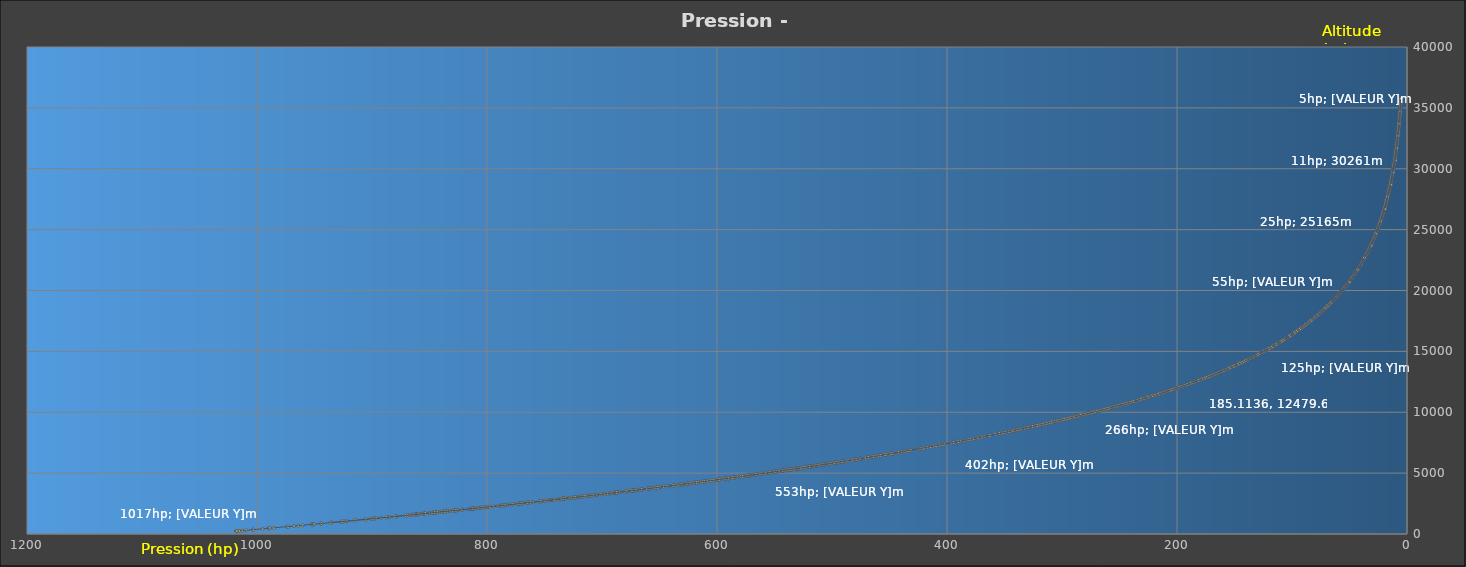
| Category | Series 0 |
|---|---|
| 1017.7116 | 235.9 |
| 1017.7116 | 236 |
| 1017.7116 | 235.9 |
| 1017.7116 | 235.9 |
| 1017.7116 | 236.3 |
| 1017.6083 | 237 |
| 1017.6083 | 237.1 |
| 1017.6083 | 237 |
| 1017.6083 | 237 |
| 1017.5049999999999 | 237.7 |
| 1017.5049999999999 | 238.2 |
| 1017.4016999999999 | 238.6 |
| 1017.0917999999999 | 241.1 |
| 1017.0917999999999 | 241 |
| 1017.1950999999999 | 240.4 |
| 1017.0917999999999 | 241.2 |
| 1016.8851999999999 | 242.8 |
| 1016.9884999999999 | 242.4 |
| 1016.9884999999999 | 242.2 |
| 1016.9884999999999 | 242.2 |
| 1017.2983999999999 | 239.4 |
| 1017.4016999999999 | 238.5 |
| 1017.4016999999999 | 238.6 |
| 1017.2983999999999 | 239.5 |
| 1015.2323999999999 | 256.8 |
| 1012.6498999999999 | 278.4 |
| 1009.4476 | 304.6 |
| 1003.6628 | 352.2 |
| 1003.0429999999999 | 357.7 |
| 994.9856 | 424.8 |
| 990.2338 | 465.6 |
| 989.5106999999999 | 471.6 |
| 988.7876 | 477.6 |
| 985.482 | 505.2 |
| 973.6025 | 606.7 |
| 972.8793999999999 | 612.6 |
| 967.8177 | 656 |
| 964.2022 | 687.3 |
| 960.2768 | 721.2 |
| 952.7358999999999 | 786.6 |
| 951.7028999999999 | 795.2 |
| 951.1863999999998 | 799.7 |
| 950.6698999999999 | 804.1 |
| 950.0500999999999 | 810 |
| 944.4718999999999 | 858 |
| 943.8521 | 863.5 |
| 934.7616999999999 | 943.8 |
| 927.0142 | 1012.3 |
| 924.3283999999999 | 1036.3 |
| 915.4445999999999 | 1116 |
| 913.6885 | 1131.6 |
| 906.4575 | 1196.7 |
| 905.2178999999999 | 1207.8 |
| 901.0858999999999 | 1245.5 |
| 899.9496 | 1256.1 |
| 898.0901999999999 | 1272.7 |
| 897.3670999999999 | 1279.6 |
| 892.0988 | 1327.8 |
| 886.0041 | 1383.6 |
| 884.5578999999999 | 1396.7 |
| 864.7243 | 1581.5 |
| 862.4517 | 1603.3 |
| 861.4187 | 1613.2 |
| 860.7988999999999 | 1618.9 |
| 860.1791 | 1624.8 |
| 859.5593 | 1630.4 |
| 857.2866999999999 | 1652.1 |
| 855.4273 | 1669.7 |
| 854.8074999999999 | 1675.7 |
| 854.1877 | 1681.9 |
| 853.4646 | 1688.1 |
| 850.4688999999998 | 1716.8 |
| 849.8491 | 1722.9 |
| 847.06 | 1749.1 |
| 846.6468 | 1753.8 |
| 846.0269999999999 | 1759.5 |
| 844.7873999999999 | 1770.7 |
| 844.2708999999999 | 1776.5 |
| 843.7543999999999 | 1781.4 |
| 841.0686 | 1807.1 |
| 839.3124999999999 | 1823.7 |
| 837.6596999999999 | 1839.3 |
| 837.2465 | 1843.7 |
| 836.8333 | 1848 |
| 835.2837999999999 | 1862.7 |
| 834.1474999999999 | 1873.6 |
| 832.3913999999999 | 1890.3 |
| 831.9781999999999 | 1895.1 |
| 829.8088999999999 | 1915.9 |
| 828.3626999999999 | 1930.3 |
| 827.7428999999998 | 1935.9 |
| 827.1231 | 1941.7 |
| 825.2636999999999 | 1960.3 |
| 821.9581 | 1992.5 |
| 821.3383 | 1998.5 |
| 816.5864999999999 | 2045.4 |
| 815.0369999999999 | 2060.2 |
| 813.7973999999999 | 2073.1 |
| 813.1776 | 2079.3 |
| 812.4544999999999 | 2085.7 |
| 811.6281 | 2094.1 |
| 811.2149 | 2098.1 |
| 809.2521999999999 | 2118 |
| 807.2895 | 2137.5 |
| 804.8103 | 2162.1 |
| 802.3311 | 2186.8 |
| 800.6782999999999 | 2202.9 |
| 799.0255 | 2219.4 |
| 794.4802999999999 | 2265.7 |
| 788.179 | 2328.6 |
| 787.4558999999999 | 2336.3 |
| 786.3196 | 2348.1 |
| 785.1832999999999 | 2359.3 |
| 781.8776999999999 | 2393.1 |
| 780.948 | 2403 |
| 778.2621999999999 | 2430.3 |
| 777.2291999999999 | 2440.8 |
| 771.9608999999999 | 2495.2 |
| 771.3411 | 2501.8 |
| 770.7212999999999 | 2507.6 |
| 769.0685 | 2524.4 |
| 768.5519999999999 | 2530.1 |
| 765.6596 | 2559.9 |
| 764.0068 | 2576.9 |
| 762.3539999999999 | 2594.7 |
| 760.0813999999999 | 2618.1 |
| 754.7098 | 2674.3 |
| 753.6768 | 2684.8 |
| 751.1976 | 2711.1 |
| 750.5777999999999 | 2717.6 |
| 746.3425 | 2762.6 |
| 745.1028999999999 | 2775.8 |
| 744.4831 | 2782 |
| 743.3467999999999 | 2794.2 |
| 742.8303 | 2800 |
| 741.7973 | 2811.2 |
| 741.2808 | 2816.4 |
| 738.4916999999999 | 2845.9 |
| 737.4586999999999 | 2857.7 |
| 736.3223999999999 | 2869.5 |
| 735.8059 | 2874.8 |
| 735.2893999999999 | 2880.2 |
| 734.3597 | 2890.7 |
| 733.9464999999999 | 2894.6 |
| 732.6036 | 2910 |
| 731.6738999999999 | 2919.2 |
| 729.1946999999999 | 2946 |
| 728.6782 | 2951.8 |
| 728.0583999999999 | 2958 |
| 727.5418999999999 | 2964.1 |
| 726.4055999999999 | 2976.2 |
| 724.3396 | 2998.8 |
| 720.7241 | 3038.3 |
| 719.1745999999999 | 3055.2 |
| 718.0382999999999 | 3067.1 |
| 716.3855 | 3085.1 |
| 712.6666999999999 | 3125.9 |
| 712.2534999999999 | 3131.2 |
| 708.9478999999999 | 3167.4 |
| 707.5016999999999 | 3183.5 |
| 706.0554999999999 | 3199.2 |
| 705.539 | 3204.5 |
| 704.506 | 3216.1 |
| 698.8245 | 3279.3 |
| 697.0683999999999 | 3299.2 |
| 693.1429999999999 | 3343.4 |
| 692.2133 | 3353.4 |
| 691.077 | 3366.5 |
| 689.9406999999999 | 3379.6 |
| 688.9077 | 3391.7 |
| 688.3911999999999 | 3397.6 |
| 687.8747 | 3403.5 |
| 687.2548999999999 | 3409.8 |
| 683.7426999999999 | 3450.1 |
| 679.8172999999999 | 3494.6 |
| 678.1645 | 3513 |
| 677.6479999999999 | 3519.2 |
| 674.9621999999999 | 3550.4 |
| 673.8258999999999 | 3563.8 |
| 671.4499999999999 | 3590.3 |
| 665.4586 | 3660.2 |
| 664.9421 | 3666.3 |
| 660.3968999999998 | 3719.6 |
| 659.7771 | 3726.4 |
| 659.1573 | 3733.3 |
| 657.9177 | 3748.6 |
| 657.1946 | 3757.2 |
| 655.8516999999999 | 3773 |
| 654.3022 | 3790.6 |
| 652.1329 | 3816.1 |
| 649.6537 | 3845.9 |
| 642.4227 | 3932.2 |
| 641.9061999999999 | 3937.6 |
| 637.2576999999999 | 3993.8 |
| 631.9893999999999 | 4058 |
| 628.5804999999999 | 4098.4 |
| 627.2376 | 4115.4 |
| 625.4815 | 4137.1 |
| 624.9649999999999 | 4142.8 |
| 623.9319999999999 | 4155.4 |
| 620.6263999999999 | 4196.6 |
| 619.6967 | 4207.4 |
| 618.6637 | 4220.4 |
| 617.5274 | 4235 |
| 616.5976999999999 | 4246 |
| 612.569 | 4295.9 |
| 610.0898 | 4327 |
| 609.6766 | 4331.7 |
| 609.2633999999999 | 4336.7 |
| 604.6148999999999 | 4395.5 |
| 601.9291 | 4429.4 |
| 600.9993999999999 | 4440.4 |
| 599.2433 | 4463.5 |
| 598.6234999999999 | 4470.5 |
| 593.9749999999999 | 4530.2 |
| 590.1528999999999 | 4578.7 |
| 589.7397 | 4583.8 |
| 588.1901999999999 | 4604.2 |
| 585.7109999999999 | 4636.1 |
| 584.3681 | 4652.8 |
| 579.8228999999999 | 4712.4 |
| 579.3063999999999 | 4718.7 |
| 577.1371 | 4746.6 |
| 576.414 | 4756 |
| 573.6248999999999 | 4792.5 |
| 571.9721 | 4815.2 |
| 571.4556 | 4821.1 |
| 568.0467 | 4866.8 |
| 566.6005 | 4886.1 |
| 566.084 | 4892.2 |
| 564.2246 | 4916.9 |
| 561.8486999999999 | 4949.5 |
| 561.4354999999999 | 4954.8 |
| 561.2289 | 4957.5 |
| 557.7167 | 5003.9 |
| 556.3738 | 5022.7 |
| 555.6506999999999 | 5031.4 |
| 554.1012 | 5053 |
| 552.8616 | 5068.9 |
| 551.1055 | 5093.3 |
| 550.6922999999999 | 5098.7 |
| 548.3163999999999 | 5131.8 |
| 543.4612999999999 | 5197.8 |
| 542.5316 | 5210.4 |
| 539.226 | 5256 |
| 538.8127999999999 | 5261.4 |
| 538.5029 | 5266.2 |
| 536.9533999999999 | 5286.9 |
| 536.5401999999999 | 5292.5 |
| 535.0939999999999 | 5312.8 |
| 534.3708999999999 | 5323 |
| 533.9576999999999 | 5328.9 |
| 533.4412 | 5335.2 |
| 533.0279999999999 | 5341.1 |
| 532.6148 | 5346.9 |
| 532.0983 | 5354.1 |
| 530.8586999999999 | 5372.2 |
| 529.929 | 5384.5 |
| 529.5158 | 5390.5 |
| 529.1026 | 5396.1 |
| 528.6894 | 5402.5 |
| 528.2761999999999 | 5408.3 |
| 525.3838 | 5448.8 |
| 521.665 | 5500.9 |
| 520.632 | 5515 |
| 520.0121999999999 | 5524 |
| 518.2561 | 5549.7 |
| 516.7066 | 5572 |
| 514.2274 | 5606.4 |
| 512.2647 | 5634.7 |
| 511.8515 | 5640.9 |
| 511.43829999999997 | 5647.1 |
| 506.37659999999994 | 5719.8 |
| 504.2073 | 5751 |
| 502.8644 | 5771 |
| 502.03799999999995 | 5783.4 |
| 500.5918 | 5804.9 |
| 498.7324 | 5832.3 |
| 496.3565 | 5866.9 |
| 495.42679999999996 | 5880.7 |
| 492.8443 | 5917.9 |
| 490.05519999999996 | 5959.8 |
| 486.1298 | 6018.4 |
| 482.92749999999995 | 6066.8 |
| 482.1011 | 6079.1 |
| 480.03509999999994 | 6109.9 |
| 479.31199999999995 | 6121.5 |
| 478.8988 | 6127.3 |
| 478.4856 | 6133.7 |
| 477.7625 | 6145.6 |
| 475.7998 | 6174.4 |
| 474.7668 | 6190.9 |
| 470.32489999999996 | 6258.3 |
| 468.8786999999999 | 6281.1 |
| 468.15559999999994 | 6292.3 |
| 465.6764 | 6330.3 |
| 464.4368 | 6349.4 |
| 463.81699999999995 | 6359.9 |
| 461.44109999999995 | 6396.3 |
| 459.16849999999994 | 6431.6 |
| 458.23879999999997 | 6447.1 |
| 456.6893 | 6470.9 |
| 454.93319999999994 | 6499.6 |
| 454.41669999999993 | 6507.1 |
| 453.5903 | 6519.6 |
| 451.5243 | 6553.8 |
| 450.9045 | 6562.6 |
| 449.9748 | 6577.4 |
| 448.0121 | 6609.3 |
| 447.08239999999995 | 6624.3 |
| 440.88439999999997 | 6724.7 |
| 439.43819999999994 | 6747.3 |
| 437.7854 | 6774.5 |
| 437.1655999999999 | 6784.4 |
| 436.0293 | 6804.1 |
| 434.6864 | 6824.6 |
| 432.82699999999994 | 6855.9 |
| 431.2775 | 6882.3 |
| 425.6993 | 6973.6 |
| 425.38939999999997 | 6980.2 |
| 424.25309999999996 | 6998.3 |
| 422.8069 | 7022.6 |
| 422.39369999999997 | 7028.7 |
| 420.32769999999994 | 7064.8 |
| 417.22869999999995 | 7116.3 |
| 414.64619999999996 | 7160.4 |
| 411.5471999999999 | 7214.5 |
| 409.5845 | 7247.3 |
| 406.48549999999994 | 7300.8 |
| 406.1756 | 7305.8 |
| 404.0063 | 7344.2 |
| 402.76669999999996 | 7366.4 |
| 402.04359999999997 | 7379.3 |
| 396.7753 | 7470.3 |
| 396.2588 | 7480.1 |
| 394.606 | 7509.3 |
| 394.0895 | 7519.1 |
| 391.40369999999996 | 7566.1 |
| 390.5773 | 7581.8 |
| 390.2674 | 7586.8 |
| 387.89149999999995 | 7630.3 |
| 384.99909999999994 | 7682.6 |
| 384.27599999999995 | 7695.1 |
| 383.55289999999997 | 7707.2 |
| 382.5199 | 7726.2 |
| 380.9704 | 7754.4 |
| 377.1483 | 7825.1 |
| 374.4625 | 7874.3 |
| 373.8426999999999 | 7885.3 |
| 373.3262 | 7896.3 |
| 373.0163 | 7901.1 |
| 370.53709999999995 | 7948 |
| 370.2271999999999 | 7953.8 |
| 368.05789999999996 | 7994.4 |
| 367.748 | 8000.3 |
| 357.93449999999996 | 8187 |
| 354.7321999999999 | 8248 |
| 354.1124 | 8259.5 |
| 352.253 | 8296.2 |
| 351.5299 | 8311.4 |
| 349.67049999999995 | 8347.1 |
| 349.05069999999995 | 8359.8 |
| 346.57149999999996 | 8407.2 |
| 346.2616 | 8414.7 |
| 344.5055 | 8448.6 |
| 343.47249999999997 | 8468.7 |
| 342.33619999999996 | 8491.9 |
| 341.4065 | 8510.8 |
| 340.89 | 8520.9 |
| 340.58009999999996 | 8525.6 |
| 340.06359999999995 | 8537.4 |
| 339.34049999999996 | 8551.2 |
| 339.03059999999994 | 8557.4 |
| 337.2745 | 8592.6 |
| 337.0679 | 8597.8 |
| 335.6217 | 8626.8 |
| 332.52269999999993 | 8690 |
| 330.8699 | 8722.9 |
| 329.6303 | 8747.6 |
| 329.21709999999996 | 8756.2 |
| 326.428 | 8814 |
| 326.11809999999997 | 8821.1 |
| 325.9115 | 8826 |
| 324.8785 | 8846.9 |
| 323.84549999999996 | 8869.1 |
| 322.296 | 8900.9 |
| 320.22999999999996 | 8944.2 |
| 319.3003 | 8964 |
| 318.37059999999997 | 8984 |
| 317.54419999999993 | 8999.8 |
| 317.33759999999995 | 9004.9 |
| 315.6848 | 9039.8 |
| 315.1683 | 9051 |
| 314.5485 | 9063.7 |
| 312.99899999999997 | 9097 |
| 311.86269999999996 | 9121 |
| 311.6561 | 9127 |
| 310.7264 | 9145.4 |
| 308.4538 | 9194.2 |
| 308.24719999999996 | 9198.8 |
| 307.73069999999996 | 9211.6 |
| 306.0779 | 9247.4 |
| 305.8713 | 9252.3 |
| 304.94159999999994 | 9272.7 |
| 304.5284 | 9281.5 |
| 303.8053 | 9296.8 |
| 303.59869999999995 | 9301.7 |
| 302.87559999999996 | 9317.5 |
| 301.32609999999994 | 9351 |
| 300.8096 | 9362.6 |
| 299.26009999999997 | 9397.1 |
| 297.50399999999996 | 9435 |
| 296.1611 | 9465.4 |
| 295.7479 | 9474.2 |
| 295.0248 | 9492.5 |
| 294.61159999999995 | 9501.1 |
| 293.6819 | 9521.1 |
| 291.0994 | 9580.3 |
| 290.7895 | 9586.4 |
| 290.3763 | 9596.6 |
| 289.75649999999996 | 9611.8 |
| 287.4839 | 9662.9 |
| 287.174 | 9670 |
| 281.90569999999997 | 9791.2 |
| 281.6991 | 9796.6 |
| 281.49249999999995 | 9801.6 |
| 279.63309999999996 | 9843.8 |
| 277.3605 | 9899.5 |
| 275.6044 | 9940 |
| 275.1912 | 9950.7 |
| 273.3318 | 9993.9 |
| 273.12519999999995 | 9998 |
| 271.0592 | 10048.9 |
| 270.4394 | 10064.5 |
| 268.1668 | 10118.1 |
| 266.1008 | 10168 |
| 265.37769999999995 | 10187.8 |
| 265.17109999999997 | 10191 |
| 263.62159999999994 | 10228.6 |
| 262.6919 | 10252.6 |
| 260.52259999999995 | 10306.6 |
| 259.28299999999996 | 10336.9 |
| 257.3203 | 10386.2 |
| 256.7005 | 10402 |
| 251.63879999999997 | 10531.4 |
| 251.01899999999998 | 10546.6 |
| 249.57279999999997 | 10582.4 |
| 246.3705 | 10666.7 |
| 246.16389999999998 | 10671.4 |
| 245.95729999999998 | 10675.7 |
| 244.6144 | 10711.1 |
| 244.2012 | 10723.2 |
| 242.96159999999998 | 10753.7 |
| 242.5484 | 10765.3 |
| 241.10219999999998 | 10804 |
| 240.17249999999999 | 10827.7 |
| 239.2428 | 10854.4 |
| 238.72629999999998 | 10866.7 |
| 237.1768 | 10908.8 |
| 234.3877 | 10983.5 |
| 230.46229999999997 | 11090.6 |
| 228.91279999999998 | 11134.6 |
| 228.29299999999998 | 11152.2 |
| 227.5699 | 11170.5 |
| 224.88409999999996 | 11245.4 |
| 224.26429999999996 | 11264.4 |
| 223.23129999999998 | 11293.3 |
| 221.99169999999998 | 11328.8 |
| 221.68179999999998 | 11335.9 |
| 221.06199999999998 | 11355.4 |
| 220.8554 | 11361.2 |
| 220.64879999999997 | 11366.4 |
| 220.029 | 11384 |
| 217.54979999999998 | 11457.6 |
| 216.00029999999998 | 11502.7 |
| 215.58709999999996 | 11514.3 |
| 214.86399999999998 | 11534.6 |
| 214.03759999999997 | 11560.5 |
| 213.31449999999998 | 11582 |
| 210.5254 | 11665.5 |
| 209.80229999999997 | 11687.5 |
| 209.4924 | 11694.8 |
| 208.25279999999998 | 11733 |
| 207.83959999999996 | 11747 |
| 206.39339999999999 | 11789.8 |
| 204.12079999999997 | 11860.3 |
| 203.2944 | 11887.4 |
| 202.7779 | 11903.2 |
| 200.71189999999999 | 11965.9 |
| 200.1954 | 11982.2 |
| 199.98879999999997 | 11991.2 |
| 199.7822 | 11995.6 |
| 198.43929999999997 | 12038.2 |
| 197.303 | 12076.5 |
| 195.96009999999998 | 12119.8 |
| 192.24129999999997 | 12239.8 |
| 191.105 | 12279.6 |
| 190.69179999999997 | 12292.2 |
| 190.3819 | 12302.8 |
| 189.5555 | 12328.7 |
| 186.97299999999998 | 12417 |
| 186.7664 | 12423.8 |
| 183.874 | 12522.9 |
| 180.2585 | 12648.4 |
| 179.742 | 12666 |
| 178.8123 | 12698.5 |
| 177.88259999999997 | 12731.7 |
| 177.0562 | 12764.4 |
| 175.60999999999999 | 12816.1 |
| 174.47369999999998 | 12857.5 |
| 173.54399999999998 | 12888.2 |
| 171.9945 | 12947.7 |
| 171.16809999999998 | 12975.7 |
| 170.13509999999997 | 13015.2 |
| 168.8955 | 13060.7 |
| 166.7262 | 13144.8 |
| 165.79649999999998 | 13180.3 |
| 162.90409999999997 | 13291.4 |
| 159.18529999999998 | 13436.8 |
| 152.6774 | 13700.1 |
| 151.9543 | 13731.2 |
| 149.99159999999998 | 13815.9 |
| 148.3388 | 13883.4 |
| 148.2355 | 13889.6 |
| 148.13219999999998 | 13895.8 |
| 147.92559999999997 | 13901.9 |
| 146.9959 | 13941.6 |
| 146.8926 | 13947.7 |
| 146.5827 | 13958.9 |
| 146.2728 | 13975.7 |
| 145.75629999999998 | 13997 |
| 145.5497 | 14003.8 |
| 145.0332 | 14026.7 |
| 144.9299 | 14030.6 |
| 144.7233 | 14043.2 |
| 144.4134 | 14052.8 |
| 143.8969 | 14075.7 |
| 143.79359999999997 | 14082.9 |
| 143.69029999999998 | 14086.3 |
| 143.3804 | 14099.5 |
| 142.45069999999998 | 14142 |
| 140.5913 | 14223.3 |
| 140.38469999999998 | 14232.4 |
| 140.17809999999997 | 14241.6 |
| 139.0418 | 14297.3 |
| 138.93849999999998 | 14301.8 |
| 138.8352 | 14306.8 |
| 136.6659 | 14406.8 |
| 136.45929999999998 | 14413.3 |
| 135.8395 | 14443.3 |
| 134.70319999999998 | 14494.8 |
| 134.5999 | 14500.2 |
| 134.29 | 14517.2 |
| 134.0834 | 14528 |
| 133.87679999999997 | 14536 |
| 133.77349999999998 | 14539.8 |
| 133.25699999999998 | 14565.5 |
| 132.43059999999997 | 14602.5 |
| 132.224 | 14613.4 |
| 131.191 | 14662.4 |
| 130.77779999999998 | 14683.7 |
| 130.4679 | 14698 |
| 130.3646 | 14702.5 |
| 128.8151 | 14782.3 |
| 127.7821 | 14831.5 |
| 127.57549999999999 | 14839.4 |
| 127.36889999999998 | 14849 |
| 126.85239999999999 | 14877.4 |
| 126.64579999999998 | 14888.5 |
| 126.4392 | 14900.1 |
| 126.23259999999999 | 14908.8 |
| 125.7161 | 14936.4 |
| 125.09629999999999 | 14964.5 |
| 124.993 | 14969.7 |
| 124.78639999999999 | 14979.6 |
| 124.06329999999998 | 15020.5 |
| 123.96 | 15023.4 |
| 122.8237 | 15082.2 |
| 122.6171 | 15091.1 |
| 122.51379999999999 | 15097.1 |
| 122.41049999999998 | 15100.7 |
| 121.99729999999998 | 15122.3 |
| 121.58409999999999 | 15146.3 |
| 121.0676 | 15172.7 |
| 120.65439999999998 | 15192.7 |
| 120.55109999999999 | 15198.3 |
| 119.93129999999998 | 15234.6 |
| 118.79499999999999 | 15292.9 |
| 118.48509999999999 | 15312.2 |
| 117.45209999999999 | 15365.5 |
| 117.34879999999998 | 15371.1 |
| 117.24549999999999 | 15374.6 |
| 116.6257 | 15409 |
| 116.4191 | 15419.8 |
| 116.1092 | 15436.6 |
| 116.00589999999998 | 15445.3 |
| 115.90259999999999 | 15451.1 |
| 115.696 | 15460.2 |
| 115.17949999999999 | 15489.9 |
| 115.0762 | 15494.3 |
| 114.86959999999999 | 15504.2 |
| 114.663 | 15518.8 |
| 114.45639999999999 | 15530.9 |
| 114.24979999999998 | 15540.7 |
| 114.14649999999999 | 15545.3 |
| 114.14649999999999 | 15548 |
| 113.3201 | 15593.4 |
| 112.70029999999998 | 15628 |
| 112.2871 | 15648.8 |
| 111.87389999999999 | 15672.9 |
| 111.564 | 15692.8 |
| 111.04749999999999 | 15720.9 |
| 110.7376 | 15740.8 |
| 110.53099999999999 | 15751.2 |
| 110.4277 | 15756.7 |
| 109.9112 | 15787.4 |
| 109.7046 | 15799.5 |
| 109.18809999999999 | 15830.1 |
| 108.56829999999998 | 15864.4 |
| 108.3617 | 15875.4 |
| 106.8122 | 15967.3 |
| 106.6056 | 15980.2 |
| 106.19239999999999 | 16003.4 |
| 105.98579999999998 | 16014.8 |
| 105.98579999999998 | 16019.9 |
| 105.5726 | 16040.8 |
| 105.46929999999999 | 16049.7 |
| 104.95279999999998 | 16078.9 |
| 104.5396 | 16101.7 |
| 104.2297 | 16121.6 |
| 103.81649999999999 | 16148.6 |
| 103.7132 | 16154.9 |
| 103.60989999999998 | 16160.1 |
| 103.50659999999999 | 16169.1 |
| 103.40329999999999 | 16174.8 |
| 103.09339999999999 | 16192.5 |
| 102.78349999999999 | 16209.6 |
| 102.6802 | 16217.8 |
| 102.267 | 16243.2 |
| 102.16369999999999 | 16251.2 |
| 101.85379999999999 | 16271.2 |
| 101.75049999999999 | 16276.8 |
| 101.234 | 16306.1 |
| 101.1307 | 16311.1 |
| 101.02739999999999 | 16321.2 |
| 100.9241 | 16326.1 |
| 100.51089999999999 | 16351 |
| 100.0977 | 16377.1 |
| 99.47789999999999 | 16416.9 |
| 99.3746 | 16428 |
| 99.0647 | 16443.1 |
| 98.96139999999998 | 16449.2 |
| 98.75479999999999 | 16465.9 |
| 98.23829999999998 | 16496.5 |
| 97.9284 | 16517 |
| 97.82509999999999 | 16523.5 |
| 97.82509999999999 | 16528 |
| 97.72179999999999 | 16532 |
| 97.41189999999999 | 16549.1 |
| 97.41189999999999 | 16554.2 |
| 96.9987 | 16576.2 |
| 96.5855 | 16605.7 |
| 96.5855 | 16609.2 |
| 96.17229999999999 | 16631.5 |
| 95.8624 | 16650.7 |
| 95.2426 | 16697.4 |
| 94.82939999999999 | 16723.2 |
| 94.5195 | 16739.9 |
| 94.4162 | 16751.5 |
| 94.10629999999999 | 16774.1 |
| 93.8997 | 16787.5 |
| 93.58979999999998 | 16805.4 |
| 93.48649999999999 | 16810 |
| 93.3832 | 16817 |
| 92.6601 | 16869.3 |
| 92.55679999999998 | 16874.5 |
| 92.45349999999999 | 16883.7 |
| 92.3502 | 16891.3 |
| 92.14359999999999 | 16903.3 |
| 92.04029999999999 | 16913 |
| 91.937 | 16918.3 |
| 91.42049999999999 | 16952.2 |
| 91.42049999999999 | 16958 |
| 91.00729999999999 | 16983.6 |
| 90.5941 | 17010.2 |
| 90.38749999999999 | 17028.3 |
| 90.07759999999999 | 17048.5 |
| 89.66439999999999 | 17077.5 |
| 89.35449999999999 | 17102.7 |
| 89.0446 | 17124.1 |
| 88.94129999999998 | 17129.3 |
| 88.838 | 17138.1 |
| 88.7347 | 17143.3 |
| 88.2182 | 17179.9 |
| 87.1852 | 17252.8 |
| 87.08189999999999 | 17263.9 |
| 86.9786 | 17273.7 |
| 86.77199999999999 | 17284.9 |
| 86.5654 | 17301.2 |
| 86.46209999999999 | 17306.1 |
| 86.46209999999999 | 17310.9 |
| 86.2555 | 17326.5 |
| 86.1522 | 17331.5 |
| 86.04889999999999 | 17337.2 |
| 85.9456 | 17349.2 |
| 85.73899999999999 | 17360 |
| 85.6357 | 17366.1 |
| 85.42909999999999 | 17384.7 |
| 85.32579999999999 | 17395.5 |
| 85.11919999999999 | 17405.7 |
| 84.70599999999999 | 17440.2 |
| 84.29279999999999 | 17465.8 |
| 84.29279999999999 | 17470.9 |
| 84.0862 | 17484.4 |
| 83.98289999999999 | 17489.1 |
| 83.8796 | 17501.6 |
| 83.5697 | 17526.7 |
| 83.4664 | 17531.5 |
| 83.0532 | 17567 |
| 82.74329999999999 | 17590 |
| 82.5367 | 17605.3 |
| 82.3301 | 17622.4 |
| 82.0202 | 17642.6 |
| 80.78059999999999 | 17737.6 |
| 80.67729999999999 | 17746.9 |
| 80.4707 | 17760.9 |
| 80.36739999999999 | 17770.7 |
| 80.36739999999999 | 17775.2 |
| 80.2641 | 17779.4 |
| 80.2641 | 17783.6 |
| 79.9542 | 17803.4 |
| 79.8509 | 17816.4 |
| 79.64429999999999 | 17826.3 |
| 79.33439999999999 | 17855.4 |
| 79.2311 | 17860.6 |
| 78.8179 | 17897.8 |
| 78.61129999999999 | 17910.5 |
| 78.4047 | 17930.9 |
| 78.1981 | 17942.4 |
| 78.1981 | 17948.3 |
| 77.8882 | 17966.3 |
| 77.7849 | 17982.4 |
| 77.57829999999998 | 17996.5 |
| 77.3717 | 18010.8 |
| 77.1651 | 18033 |
| 76.6486 | 18074.9 |
| 76.54529999999998 | 18079.5 |
| 76.442 | 18093.3 |
| 76.23539999999998 | 18107.5 |
| 76.02879999999999 | 18123.3 |
| 75.9255 | 18133.7 |
| 75.8222 | 18143.7 |
| 75.71889999999999 | 18148.2 |
| 75.2024 | 18193.1 |
| 74.8925 | 18216.9 |
| 74.5826 | 18241.7 |
| 74.1694 | 18282 |
| 74.06609999999999 | 18287.1 |
| 73.96279999999999 | 18296 |
| 73.96279999999999 | 18301.1 |
| 73.8595 | 18306.6 |
| 73.5496 | 18333.3 |
| 73.2397 | 18357.6 |
| 72.8265 | 18394.9 |
| 72.5166 | 18422 |
| 72.5166 | 18426.3 |
| 72.30999999999999 | 18445.5 |
| 72.0001 | 18466.5 |
| 72.0001 | 18472.7 |
| 71.89679999999998 | 18482.3 |
| 71.38029999999999 | 18521.2 |
| 70.7605 | 18575 |
| 70.4506 | 18608.1 |
| 70.244 | 18628.2 |
| 69.9341 | 18656.5 |
| 69.72749999999999 | 18671.9 |
| 69.6242 | 18684 |
| 69.31429999999999 | 18705.2 |
| 69.1077 | 18726.1 |
| 68.9011 | 18747.4 |
| 68.9011 | 18752 |
| 68.7978 | 18756.7 |
| 68.38459999999999 | 18793.3 |
| 67.7648 | 18856.2 |
| 67.66149999999999 | 18866.3 |
| 67.4549 | 18877.8 |
| 67.0417 | 18919.8 |
| 67.0417 | 18923.4 |
| 66.73179999999999 | 18946.6 |
| 66.73179999999999 | 18951.9 |
| 66.62849999999999 | 18956.7 |
| 66.62849999999999 | 18961.8 |
| 66.5252 | 18973.1 |
| 66.3186 | 18987.6 |
| 66.3186 | 18992 |
| 66.21529999999998 | 19002.7 |
| 65.90539999999999 | 19026.9 |
| 65.8021 | 19043 |
| 65.69879999999999 | 19052.3 |
| 65.5955 | 19056.9 |
| 65.5955 | 19062.2 |
| 65.4922 | 19068 |
| 65.38889999999999 | 19079 |
| 65.1823 | 19096.3 |
| 65.1823 | 19101.8 |
| 64.97569999999999 | 19123.8 |
| 64.5625 | 19159.2 |
| 64.4592 | 19175.5 |
| 64.35589999999999 | 19185.2 |
| 64.04599999999999 | 19213.2 |
| 63.942699999999995 | 19224.6 |
| 63.7361 | 19240.3 |
| 63.7361 | 19246.3 |
| 63.632799999999996 | 19252.1 |
| 63.426199999999994 | 19271.8 |
| 63.32289999999999 | 19287.1 |
| 63.2196 | 19292.2 |
| 63.2196 | 19297.8 |
| 63.013 | 19316.7 |
| 62.909699999999994 | 19322.9 |
| 62.80639999999999 | 19334 |
| 62.4965 | 19363.7 |
| 62.39319999999999 | 19372.5 |
| 62.39319999999999 | 19377.9 |
| 62.28989999999999 | 19383.7 |
| 62.083299999999994 | 19413 |
| 61.98 | 19417.3 |
| 61.773399999999995 | 19443.7 |
| 61.6701 | 19448.5 |
| 61.6701 | 19453.4 |
| 61.56679999999999 | 19458.4 |
| 61.463499999999996 | 19473.3 |
| 61.256899999999995 | 19494.4 |
| 61.1536 | 19499.5 |
| 61.1536 | 19503.2 |
| 61.0503 | 19512.6 |
| 61.0503 | 19518.1 |
| 60.5338 | 19569.4 |
| 60.120599999999996 | 19608.2 |
| 60.0173 | 19626.3 |
| 59.913999999999994 | 19631.2 |
| 59.8107 | 19646 |
| 59.604099999999995 | 19666.4 |
| 59.5008 | 19681.7 |
| 59.19089999999999 | 19705.8 |
| 58.777699999999996 | 19753.1 |
| 58.777699999999996 | 19758.8 |
| 58.67439999999999 | 19764.5 |
| 58.67439999999999 | 19769.5 |
| 58.5711 | 19778.4 |
| 58.4678 | 19789 |
| 58.4678 | 19794 |
| 58.261199999999995 | 19814.3 |
| 58.15789999999999 | 19828.4 |
| 57.951299999999996 | 19844.7 |
| 57.951299999999996 | 19848.9 |
| 57.744699999999995 | 19872.5 |
| 57.5381 | 19891.1 |
| 57.228199999999994 | 19921.8 |
| 57.12489999999999 | 19931.8 |
| 57.12489999999999 | 19937 |
| 56.815 | 19970.8 |
| 56.71169999999999 | 19978.9 |
| 56.71169999999999 | 19983.5 |
| 56.608399999999996 | 19988.5 |
| 56.608399999999996 | 19993.2 |
| 56.401799999999994 | 20013.5 |
| 56.2985 | 20024.7 |
| 56.19519999999999 | 20040.6 |
| 56.091899999999995 | 20051.3 |
| 55.885299999999994 | 20074.1 |
| 55.782 | 20082.8 |
| 55.782 | 20092.4 |
| 55.67869999999999 | 20103.6 |
| 55.575399999999995 | 20112.1 |
| 55.4721 | 20121.8 |
| 55.16219999999999 | 20157.1 |
| 55.058899999999994 | 20173 |
| 54.9556 | 20182.8 |
| 54.8523 | 20192.9 |
| 54.64569999999999 | 20219.7 |
| 54.542399999999994 | 20225.2 |
| 54.542399999999994 | 20229.9 |
| 54.542399999999994 | 20234.2 |
| 54.3358 | 20256.3 |
| 54.232499999999995 | 20271.3 |
| 54.02589999999999 | 20290.5 |
| 53.922599999999996 | 20301.3 |
| 53.922599999999996 | 20307 |
| 53.715999999999994 | 20322.3 |
| 53.715999999999994 | 20327.8 |
| 53.3028 | 20370.7 |
| 53.19949999999999 | 20386.4 |
| 52.7863 | 20432.7 |
| 52.68299999999999 | 20445 |
| 52.68299999999999 | 20455.3 |
| 52.579699999999995 | 20464.7 |
| 52.47639999999999 | 20470.3 |
| 52.3731 | 20486.4 |
| 52.3731 | 20491.8 |
| 52.2698 | 20497.2 |
| 52.2698 | 20502.1 |
| 52.1665 | 20506.9 |
| 52.063199999999995 | 20523.7 |
| 51.65 | 20569.8 |
| 51.546699999999994 | 20590.1 |
| 51.3401 | 20613.3 |
| 51.236799999999995 | 20620 |
| 51.030199999999994 | 20654.4 |
| 50.926899999999996 | 20663.8 |
| 50.8236 | 20674.8 |
| 50.720299999999995 | 20685.1 |
| 50.617 | 20699.6 |
| 50.51369999999999 | 20716.9 |
| 50.51369999999999 | 20721.7 |
| 50.410399999999996 | 20732.1 |
| 50.3071 | 20743 |
| 50.203799999999994 | 20753.3 |
| 50.203799999999994 | 20759.1 |
| 50.1005 | 20771.1 |
| 49.893899999999995 | 20793.1 |
| 49.7906 | 20804.6 |
| 49.7906 | 20810.4 |
| 49.583999999999996 | 20832.8 |
| 49.583999999999996 | 20838.3 |
| 49.2741 | 20874.1 |
| 49.1708 | 20890.3 |
| 49.067499999999995 | 20901.8 |
| 48.9642 | 20912.3 |
| 48.9642 | 20917.4 |
| 48.860899999999994 | 20922.8 |
| 48.860899999999994 | 20928.1 |
| 48.860899999999994 | 20933.5 |
| 48.7576 | 20938.4 |
| 48.6543 | 20948.9 |
| 48.6543 | 20961.3 |
| 48.550999999999995 | 20972.3 |
| 48.4477 | 20977.5 |
| 48.4477 | 20982.6 |
| 48.34439999999999 | 20997.6 |
| 48.034499999999994 | 21036.8 |
| 47.82789999999999 | 21058.9 |
| 47.7246 | 21080.5 |
| 47.517999999999994 | 21107.6 |
| 47.1048 | 21162.8 |
| 46.898199999999996 | 21195.2 |
| 46.79489999999999 | 21209.5 |
| 46.5883 | 21226.7 |
| 46.485 | 21241.8 |
| 46.485 | 21247.8 |
| 46.381699999999995 | 21259 |
| 46.27839999999999 | 21268.4 |
| 46.27839999999999 | 21273.6 |
| 46.1751 | 21284.4 |
| 46.1751 | 21294.2 |
| 45.9685 | 21316.8 |
| 45.865199999999994 | 21331.9 |
| 45.6586 | 21354.1 |
| 45.6586 | 21359.6 |
| 45.6586 | 21365.3 |
| 45.348699999999994 | 21395.2 |
| 45.1421 | 21432.2 |
| 45.038799999999995 | 21442.8 |
| 45.038799999999995 | 21447.3 |
| 45.038799999999995 | 21451.9 |
| 44.83219999999999 | 21478.6 |
| 44.6256 | 21500.8 |
| 44.6256 | 21511.3 |
| 44.5223 | 21516.7 |
| 44.419 | 21538.2 |
| 44.31569999999999 | 21543.6 |
| 44.212399999999995 | 21557.6 |
| 44.1091 | 21580.7 |
| 44.0058 | 21600.5 |
| 43.902499999999996 | 21606 |
| 43.79919999999999 | 21626 |
| 43.695899999999995 | 21638.2 |
| 43.5926 | 21652.2 |
| 43.5926 | 21657.5 |
| 43.4893 | 21667.7 |
| 43.385999999999996 | 21682.6 |
| 43.2827 | 21702.2 |
| 43.2827 | 21706.3 |
| 43.179399999999994 | 21710.9 |
| 43.0761 | 21732.7 |
| 42.9728 | 21748.7 |
| 42.869499999999995 | 21759.8 |
| 42.869499999999995 | 21768.1 |
| 42.7662 | 21773 |
| 42.4563 | 21819.4 |
| 42.4563 | 21824.4 |
| 42.4563 | 21829.6 |
| 42.2497 | 21851.2 |
| 42.0431 | 21886.9 |
| 42.0431 | 21892.9 |
| 41.9398 | 21899.1 |
| 41.7332 | 21926.7 |
| 41.7332 | 21937 |
| 41.5266 | 21957.7 |
| 41.31999999999999 | 21998.4 |
| 41.216699999999996 | 22015.3 |
| 41.11339999999999 | 22020.9 |
| 41.11339999999999 | 22031.1 |
| 41.0101 | 22049.3 |
| 40.9068 | 22054.5 |
| 40.9068 | 22059.8 |
| 40.8035 | 22071.1 |
| 40.8035 | 22076.4 |
| 40.8035 | 22081.1 |
| 40.700199999999995 | 22090.7 |
| 40.700199999999995 | 22096.3 |
| 40.59689999999999 | 22112.5 |
| 40.4936 | 22122.9 |
| 40.390299999999996 | 22135.4 |
| 40.287 | 22150.6 |
| 40.287 | 22156.4 |
| 40.287 | 22162.1 |
| 40.183699999999995 | 22171.8 |
| 40.0804 | 22182.8 |
| 40.0804 | 22188.8 |
| 40.0804 | 22194.2 |
| 39.9771 | 22203.7 |
| 39.9771 | 22209.5 |
| 39.873799999999996 | 22230.8 |
| 39.7705 | 22242.3 |
| 39.667199999999994 | 22253.4 |
| 39.5639 | 22280.5 |
| 39.254 | 22318.1 |
| 39.254 | 22323.6 |
| 39.047399999999996 | 22356.5 |
| 39.047399999999996 | 22363 |
| 38.8408 | 22385.2 |
| 38.530899999999995 | 22449.8 |
| 38.4276 | 22455.8 |
| 38.4276 | 22468.2 |
| 38.3243 | 22473.2 |
| 38.221 | 22503.2 |
| 38.11769999999999 | 22508 |
| 38.11769999999999 | 22513 |
| 37.8078 | 22555.7 |
| 37.8078 | 22568 |
| 37.704499999999996 | 22573.5 |
| 37.6012 | 22592.7 |
| 37.6012 | 22598.5 |
| 37.497899999999994 | 22620.1 |
| 37.3946 | 22637.5 |
| 37.2913 | 22653.2 |
| 37.187999999999995 | 22672.2 |
| 37.187999999999995 | 22677.8 |
| 37.0847 | 22683.9 |
| 36.981399999999994 | 22696.9 |
| 36.981399999999994 | 22703 |
| 36.8781 | 22732.5 |
| 36.7748 | 22749.1 |
| 36.671499999999995 | 22755.5 |
| 36.671499999999995 | 22762.3 |
| 36.5682 | 22774.7 |
| 36.5682 | 22786.7 |
| 36.3616 | 22811.5 |
| 36.2583 | 22837.5 |
| 36.154999999999994 | 22855.9 |
| 36.0517 | 22862.5 |
| 35.94839999999999 | 22886.3 |
| 35.8451 | 22898.7 |
| 35.8451 | 22904 |
| 35.7418 | 22929.7 |
| 35.6385 | 22935.6 |
| 35.535199999999996 | 22961.1 |
| 35.43189999999999 | 22978.3 |
| 35.3286 | 22990.4 |
| 35.3286 | 23001.2 |
| 35.3286 | 23007.4 |
| 35.2253 | 23025.9 |
| 35.122 | 23031.7 |
| 35.018699999999995 | 23050.9 |
| 35.018699999999995 | 23061.6 |
| 34.8121 | 23085.6 |
| 34.7088 | 23116.6 |
| 34.502199999999995 | 23156.4 |
| 34.3989 | 23162.3 |
| 34.2956 | 23189.8 |
| 34.192299999999996 | 23202.7 |
| 34.089 | 23225.5 |
| 34.089 | 23237.4 |
| 33.985699999999994 | 23242.4 |
| 33.985699999999994 | 23247.6 |
| 33.8824 | 23259.6 |
| 33.8824 | 23271.3 |
| 33.7791 | 23282.1 |
| 33.7791 | 23287.9 |
| 33.675799999999995 | 23299.7 |
| 33.675799999999995 | 23315.1 |
| 33.469199999999994 | 23345.8 |
| 33.469199999999994 | 23350.8 |
| 33.469199999999994 | 23355.4 |
| 33.365899999999996 | 23360.4 |
| 33.2626 | 23382.4 |
| 33.2626 | 23394 |
| 33.056 | 23426.6 |
| 33.056 | 23432.3 |
| 32.95269999999999 | 23448.3 |
| 32.849399999999996 | 23475.3 |
| 32.6428 | 23502.2 |
| 32.5395 | 23520.6 |
| 32.5395 | 23525.7 |
| 32.332899999999995 | 23562.8 |
| 32.2296 | 23582.8 |
| 32.1263 | 23604.3 |
| 32.1263 | 23609.5 |
| 32.022999999999996 | 23635.4 |
| 31.919699999999995 | 23647.1 |
| 31.816399999999998 | 23662.8 |
| 31.713099999999997 | 23695.5 |
| 31.5065 | 23729.8 |
| 31.5065 | 23740.9 |
| 31.403199999999995 | 23745.9 |
| 31.403199999999995 | 23762.8 |
| 31.299899999999997 | 23773 |
| 31.196599999999997 | 23789.2 |
| 31.196599999999997 | 23801 |
| 31.0933 | 23823.3 |
| 30.783399999999997 | 23877.5 |
| 30.783399999999997 | 23883.4 |
| 30.783399999999997 | 23889.4 |
| 30.680099999999996 | 23900 |
| 30.370199999999997 | 23961.2 |
| 30.370199999999997 | 23966.3 |
| 30.370199999999997 | 23977 |
| 30.2669 | 23983.2 |
| 30.163599999999995 | 24018.3 |
| 30.163599999999995 | 24024.2 |
| 30.060299999999998 | 24029.6 |
| 30.060299999999998 | 24048.7 |
| 29.956999999999997 | 24060.2 |
| 29.853699999999996 | 24071.5 |
| 29.7504 | 24106.6 |
| 29.7504 | 24113.1 |
| 29.543799999999997 | 24160.5 |
| 29.440499999999997 | 24171.7 |
| 29.337199999999996 | 24192.4 |
| 29.337199999999996 | 24204.8 |
| 29.2339 | 24211.2 |
| 29.2339 | 24218 |
| 29.130599999999998 | 24248 |
| 29.0273 | 24254.4 |
| 29.0273 | 24266.7 |
| 29.0273 | 24272.2 |
| 28.924 | 24297.3 |
| 28.820699999999995 | 24303.4 |
| 28.820699999999995 | 24309 |
| 28.614099999999997 | 24351.8 |
| 28.5108 | 24386.2 |
| 28.5108 | 24390.6 |
| 28.304199999999998 | 24416.5 |
| 27.9943 | 24501.4 |
| 27.9943 | 24507.1 |
| 27.891 | 24513.1 |
| 27.787699999999997 | 24535.8 |
| 27.581099999999996 | 24593.2 |
| 27.4778 | 24616.3 |
| 27.374499999999998 | 24641.5 |
| 27.374499999999998 | 24646.9 |
| 27.374499999999998 | 24652.7 |
| 27.271199999999997 | 24658.6 |
| 27.271199999999997 | 24670.5 |
| 27.1679 | 24693.1 |
| 27.0646 | 24726 |
| 26.961299999999998 | 24738 |
| 26.857999999999997 | 24762.2 |
| 26.857999999999997 | 24768.6 |
| 26.6514 | 24806.1 |
| 26.548099999999998 | 24828.2 |
| 26.548099999999998 | 24834.7 |
| 26.548099999999998 | 24852.7 |
| 26.238199999999996 | 24908.3 |
| 26.238199999999996 | 24920.3 |
| 26.238199999999996 | 24925.9 |
| 26.1349 | 24950.3 |
| 26.031599999999997 | 24955.4 |
| 25.9283 | 24992.2 |
| 25.825 | 25011.6 |
| 25.721699999999995 | 25035.5 |
| 25.618399999999998 | 25059.8 |
| 25.618399999999998 | 25065.9 |
| 25.618399999999998 | 25077.5 |
| 25.515099999999997 | 25087.6 |
| 25.515099999999997 | 25092.9 |
| 25.515099999999997 | 25104.9 |
| 25.4118 | 25127.2 |
| 25.4118 | 25132.9 |
| 25.3085 | 25149.1 |
| 25.205199999999998 | 25165.6 |
| 25.205199999999998 | 25177.8 |
| 25.205199999999998 | 25183.6 |
| 25.205199999999998 | 25189.4 |
| 24.998599999999996 | 25237.2 |
| 24.8953 | 25243.5 |
| 24.8953 | 25255.6 |
| 24.791999999999998 | 25278.8 |
| 24.791999999999998 | 25292.3 |
| 24.688699999999997 | 25304.1 |
| 24.688699999999997 | 25321.5 |
| 24.5854 | 25332.7 |
| 24.5854 | 25342.9 |
| 24.4821 | 25371.4 |
| 24.3788 | 25382.3 |
| 24.3788 | 25388.3 |
| 24.275499999999997 | 25427.8 |
| 24.172199999999997 | 25434.4 |
| 24.172199999999997 | 25450.5 |
| 24.0689 | 25480.6 |
| 23.9656 | 25491.4 |
| 23.9656 | 25510.6 |
| 23.8623 | 25527.8 |
| 23.8623 | 25541.1 |
| 23.758999999999997 | 25547.4 |
| 23.758999999999997 | 25553.1 |
| 23.5524 | 25613.6 |
| 23.5524 | 25620.3 |
| 23.449099999999998 | 25631.5 |
| 23.449099999999998 | 25637.4 |
| 23.449099999999998 | 25656.4 |
| 23.3458 | 25667 |
| 23.3458 | 25672.7 |
| 23.2425 | 25691.6 |
| 23.2425 | 25697.1 |
| 23.2425 | 25709 |
| 23.139199999999995 | 25739.3 |
| 23.035899999999998 | 25758.5 |
| 23.035899999999998 | 25767.8 |
| 23.035899999999998 | 25773.1 |
| 22.8293 | 25818.9 |
| 22.8293 | 25825.4 |
| 22.726 | 25836.7 |
| 22.726 | 25842.5 |
| 22.726 | 25861.8 |
| 22.6227 | 25867.6 |
| 22.6227 | 25873 |
| 22.416099999999997 | 25935.6 |
| 22.3128 | 25968.7 |
| 22.3128 | 25975.9 |
| 22.106199999999998 | 26039.2 |
| 22.0029 | 26046.3 |
| 22.0029 | 26059.1 |
| 22.0029 | 26065.2 |
| 22.0029 | 26071.6 |
| 21.899599999999996 | 26078.2 |
| 21.899599999999996 | 26098.2 |
| 21.7963 | 26115.5 |
| 21.7963 | 26129.3 |
| 21.692999999999998 | 26142.2 |
| 21.692999999999998 | 26148.3 |
| 21.692999999999998 | 26161.1 |
| 21.589699999999997 | 26174.3 |
| 21.589699999999997 | 26180.5 |
| 21.589699999999997 | 26192.4 |
| 21.4864 | 26206.4 |
| 21.4864 | 26212.7 |
| 21.4864 | 26218.5 |
| 21.4864 | 26224.4 |
| 21.3831 | 26230.6 |
| 21.3831 | 26256.3 |
| 21.279799999999998 | 26268.9 |
| 21.279799999999998 | 26283 |
| 21.279799999999998 | 26289 |
| 21.073199999999996 | 26340 |
| 20.8666 | 26399.1 |
| 20.7633 | 26424.8 |
| 20.7633 | 26431.8 |
| 20.7633 | 26438.5 |
| 20.659999999999997 | 26455.4 |
| 20.659999999999997 | 26468.2 |
| 20.659999999999997 | 26474.8 |
| 20.556699999999996 | 26486.7 |
| 20.556699999999996 | 26511 |
| 20.350099999999998 | 26558.7 |
| 20.350099999999998 | 26574.5 |
| 20.2468 | 26593.1 |
| 20.2468 | 26599.2 |
| 20.1435 | 26630.2 |
| 20.0402 | 26666.1 |
| 20.0402 | 26671.8 |
| 20.0402 | 26676.9 |
| 19.936899999999998 | 26701.2 |
| 19.936899999999998 | 26706.7 |
| 19.936899999999998 | 26712.3 |
| 19.833599999999997 | 26718.6 |
| 19.833599999999997 | 26725.2 |
| 19.833599999999997 | 26742.2 |
| 19.7303 | 26771.2 |
| 19.7303 | 26782.5 |
| 19.627 | 26806.4 |
| 19.627 | 26811.1 |
| 19.523699999999998 | 26825.4 |
| 19.523699999999998 | 26837.3 |
| 19.523699999999998 | 26843.1 |
| 19.523699999999998 | 26848.3 |
| 19.523699999999998 | 26853.1 |
| 19.4204 | 26870.3 |
| 19.4204 | 26876.2 |
| 19.1105 | 26963.5 |
| 19.1105 | 26969.7 |
| 19.1105 | 26982 |
| 19.1105 | 26986.9 |
| 19.007199999999997 | 27003.3 |
| 19.007199999999997 | 27009.3 |
| 19.007199999999997 | 27019.9 |
| 18.9039 | 27038.8 |
| 18.9039 | 27045 |
| 18.9039 | 27054.2 |
| 18.9039 | 27065.5 |
| 18.8006 | 27077.1 |
| 18.8006 | 27082 |
| 18.8006 | 27087.1 |
| 18.593999999999998 | 27153 |
| 18.490699999999997 | 27182.1 |
| 18.490699999999997 | 27204.9 |
| 18.490699999999997 | 27210.1 |
| 18.3874 | 27232.1 |
| 18.3874 | 27243.8 |
| 18.2841 | 27277.4 |
| 18.2841 | 27282.5 |
| 18.1808 | 27293.1 |
| 18.1808 | 27305.1 |
| 18.1808 | 27311.1 |
| 18.1808 | 27322.1 |
| 18.077499999999997 | 27334.5 |
| 18.077499999999997 | 27340.6 |
| 18.077499999999997 | 27346 |
| 18.077499999999997 | 27351 |
| 17.974199999999996 | 27362 |
| 17.974199999999996 | 27368.9 |
| 17.974199999999996 | 27392.5 |
| 17.767599999999998 | 27471.1 |
| 17.6643 | 27488.2 |
| 17.6643 | 27501.9 |
| 17.6643 | 27508.3 |
| 17.561 | 27513.9 |
| 17.561 | 27519.3 |
| 17.561 | 27537.9 |
| 17.457699999999996 | 27562.6 |
| 17.457699999999996 | 27569.6 |
| 17.457699999999996 | 27583.1 |
| 17.457699999999996 | 27588.7 |
| 17.3544 | 27594.6 |
| 17.251099999999997 | 27639.8 |
| 17.1478 | 27671.1 |
| 17.1478 | 27684.5 |
| 17.1478 | 27696.7 |
| 17.0445 | 27722.4 |
| 17.0445 | 27727.9 |
| 16.9412 | 27767.3 |
| 16.9412 | 27780.3 |
| 16.837899999999998 | 27822.7 |
| 16.734599999999997 | 27829.1 |
| 16.6313 | 27888.9 |
| 16.6313 | 27894.7 |
| 16.528 | 27915 |
| 16.424699999999998 | 27966.5 |
| 16.424699999999998 | 27984.9 |
| 16.3214 | 27991.8 |
| 16.3214 | 28012.2 |
| 16.3214 | 28025.5 |
| 16.2181 | 28039.9 |
| 16.2181 | 28046.3 |
| 16.2181 | 28052.1 |
| 16.2181 | 28058.2 |
| 16.2181 | 28064.7 |
| 16.2181 | 28071.4 |
| 16.1148 | 28084.9 |
| 16.1148 | 28091 |
| 16.1148 | 28103.2 |
| 16.011499999999998 | 28135.1 |
| 15.908199999999999 | 28178.7 |
| 15.908199999999999 | 28191 |
| 15.908199999999999 | 28197.7 |
| 15.8049 | 28210.8 |
| 15.8049 | 28234.1 |
| 15.701599999999997 | 28271.4 |
| 15.701599999999997 | 28284.8 |
| 15.598299999999998 | 28291.8 |
| 15.598299999999998 | 28316.7 |
| 15.598299999999998 | 28329.9 |
| 15.495 | 28341.5 |
| 15.495 | 28346.8 |
| 15.495 | 28351.9 |
| 15.391699999999998 | 28392.1 |
| 15.391699999999998 | 28408.6 |
| 15.391699999999998 | 28414.7 |
| 15.2884 | 28441.1 |
| 15.2884 | 28452 |
| 15.185099999999998 | 28470.4 |
| 15.185099999999998 | 28475.7 |
| 15.185099999999998 | 28490.9 |
| 15.081799999999998 | 28509.2 |
| 15.081799999999998 | 28519.4 |
| 15.081799999999998 | 28530.9 |
| 14.978499999999999 | 28559.9 |
| 14.978499999999999 | 28572.1 |
| 14.8752 | 28598.8 |
| 14.8752 | 28610.7 |
| 14.771899999999999 | 28649.4 |
| 14.771899999999999 | 28654.4 |
| 14.771899999999999 | 28658.9 |
| 14.771899999999999 | 28663.7 |
| 14.771899999999999 | 28668.9 |
| 14.668599999999998 | 28719.2 |
| 14.668599999999998 | 28724.4 |
| 14.565299999999999 | 28775 |
| 14.565299999999999 | 28781.1 |
| 14.462 | 28792.8 |
| 14.462 | 28819.3 |
| 14.462 | 28825.8 |
| 14.358699999999999 | 28831.7 |
| 14.358699999999999 | 28848.1 |
| 14.358699999999999 | 28867.2 |
| 14.358699999999999 | 28872.7 |
| 14.2554 | 28878.3 |
| 14.152099999999999 | 28936.9 |
| 14.152099999999999 | 28948.1 |
| 14.152099999999999 | 28954.5 |
| 14.152099999999999 | 28961.1 |
| 14.048799999999998 | 28977.8 |
| 14.048799999999998 | 28989.2 |
| 14.048799999999998 | 29007.6 |
| 13.9455 | 29060.7 |
| 13.9455 | 29066.1 |
| 13.8422 | 29102.4 |
| 13.8422 | 29113.4 |
| 13.635599999999998 | 29178 |
| 13.635599999999998 | 29195.4 |
| 13.635599999999998 | 29200.2 |
| 13.5323 | 29232.2 |
| 13.5323 | 29261.1 |
| 13.5323 | 29267.6 |
| 13.428999999999998 | 29273.6 |
| 13.428999999999998 | 29290.9 |
| 13.428999999999998 | 29304.3 |
| 13.428999999999998 | 29310.8 |
| 13.3257 | 29332.8 |
| 13.3257 | 29338.9 |
| 13.3257 | 29358.1 |
| 13.2224 | 29400.7 |
| 13.2224 | 29412.7 |
| 13.2224 | 29418 |
| 13.119099999999998 | 29448.7 |
| 13.119099999999998 | 29454.9 |
| 13.119099999999998 | 29460.4 |
| 13.015799999999999 | 29493.3 |
| 13.015799999999999 | 29505.6 |
| 13.015799999999999 | 29526.1 |
| 12.9125 | 29537.6 |
| 12.9125 | 29550.1 |
| 12.9125 | 29575 |
| 12.809199999999999 | 29599.8 |
| 12.809199999999999 | 29611.6 |
| 12.809199999999999 | 29617.2 |
| 12.809199999999999 | 29623.4 |
| 12.809199999999999 | 29630.1 |
| 12.7059 | 29649 |
| 12.7059 | 29661.2 |
| 12.7059 | 29686 |
| 12.602599999999999 | 29691.5 |
| 12.499299999999998 | 29744.4 |
| 12.499299999999998 | 29784.7 |
| 12.395999999999999 | 29819.7 |
| 12.395999999999999 | 29835.9 |
| 12.395999999999999 | 29846.9 |
| 12.2927 | 29859.2 |
| 12.2927 | 29865.1 |
| 12.2927 | 29895.2 |
| 12.2927 | 29901.1 |
| 12.1894 | 29912.6 |
| 12.1894 | 29956.7 |
| 12.086099999999998 | 29987.6 |
| 12.086099999999998 | 29999.3 |
| 12.086099999999998 | 30004.2 |
| 12.086099999999998 | 30008.8 |
| 11.9828 | 30030.5 |
| 11.9828 | 30041 |
| 11.9828 | 30062.4 |
| 11.879499999999998 | 30079.7 |
| 11.879499999999998 | 30093.8 |
| 11.879499999999998 | 30104.5 |
| 11.879499999999998 | 30120.5 |
| 11.879499999999998 | 30130 |
| 11.7762 | 30146.6 |
| 11.7762 | 30165.5 |
| 11.7762 | 30175.6 |
| 11.7762 | 30181.5 |
| 11.7762 | 30187.5 |
| 11.7762 | 30192.8 |
| 11.6729 | 30197.4 |
| 11.6729 | 30202.2 |
| 11.6729 | 30224.3 |
| 11.6729 | 30233.9 |
| 11.569599999999998 | 30261.6 |
| 11.569599999999998 | 30271.8 |
| 11.569599999999998 | 30277.3 |
| 11.569599999999998 | 30302.3 |
| 11.466299999999999 | 30324 |
| 11.466299999999999 | 30328.7 |
| 11.466299999999999 | 30337.2 |
| 11.466299999999999 | 30347.1 |
| 11.363 | 30379.1 |
| 11.363 | 30394.7 |
| 11.363 | 30409.7 |
| 11.363 | 30414.5 |
| 11.259699999999999 | 30448.1 |
| 11.1564 | 30515.5 |
| 11.1564 | 30525.4 |
| 11.1564 | 30535.6 |
| 11.1564 | 30541.4 |
| 11.053099999999999 | 30565.6 |
| 11.053099999999999 | 30571.2 |
| 11.053099999999999 | 30592.8 |
| 11.053099999999999 | 30604.7 |
| 10.949799999999998 | 30620.5 |
| 10.949799999999998 | 30630.2 |
| 10.949799999999998 | 30670.8 |
| 10.846499999999999 | 30686 |
| 10.846499999999999 | 30715.7 |
| 10.7432 | 30749.3 |
| 10.7432 | 30754.6 |
| 10.7432 | 30760 |
| 10.7432 | 30777 |
| 10.7432 | 30795.4 |
| 10.639899999999999 | 30806.4 |
| 10.639899999999999 | 30812.1 |
| 10.639899999999999 | 30825.2 |
| 10.639899999999999 | 30848.9 |
| 10.639899999999999 | 30868 |
| 10.536599999999998 | 30905.3 |
| 10.4333 | 30974.2 |
| 10.4333 | 30979.7 |
| 10.329999999999998 | 31005 |
| 10.329999999999998 | 31011.4 |
| 10.329999999999998 | 31036.2 |
| 10.329999999999998 | 31043 |
| 10.2267 | 31070.1 |
| 10.2267 | 31094.3 |
| 10.2267 | 31108.4 |
| 10.2267 | 31114.9 |
| 10.2267 | 31134 |
| 10.1234 | 31155.9 |
| 10.1234 | 31162.7 |
| 10.0201 | 31222.4 |
| 10.0201 | 31235.1 |
| 10.0201 | 31257.3 |
| 9.916799999999999 | 31297.4 |
| 9.916799999999999 | 31304.6 |
| 9.916799999999999 | 31337.4 |
| 9.8135 | 31352.1 |
| 9.8135 | 31364.9 |
| 9.8135 | 31371.1 |
| 9.8135 | 31384.3 |
| 9.7102 | 31453.3 |
| 9.7102 | 31466.7 |
| 9.6069 | 31485.1 |
| 9.6069 | 31513.6 |
| 9.6069 | 31533.2 |
| 9.503599999999999 | 31554.9 |
| 9.503599999999999 | 31562 |
| 9.503599999999999 | 31595.2 |
| 9.4003 | 31628.6 |
| 9.4003 | 31656.7 |
| 9.4003 | 31681 |
| 9.4003 | 31688.2 |
| 9.296999999999999 | 31727.1 |
| 9.296999999999999 | 31741.5 |
| 9.296999999999999 | 31754.3 |
| 9.296999999999999 | 31767.2 |
| 9.1937 | 31826.8 |
| 9.1937 | 31844.8 |
| 9.0904 | 31863.3 |
| 9.0904 | 31883.1 |
| 9.0904 | 31895.1 |
| 8.987099999999998 | 31938.7 |
| 8.987099999999998 | 31945 |
| 8.987099999999998 | 31951.5 |
| 8.987099999999998 | 31974.1 |
| 8.987099999999998 | 31980.1 |
| 8.987099999999998 | 31986.5 |
| 8.883799999999999 | 32020.6 |
| 8.7805 | 32116.5 |
| 8.7805 | 32122.2 |
| 8.7805 | 32149.6 |
| 8.6772 | 32166.6 |
| 8.6772 | 32183.2 |
| 8.6772 | 32188 |
| 8.6772 | 32198.3 |
| 8.6772 | 32220.9 |
| 8.5739 | 32246.9 |
| 8.5739 | 32274.5 |
| 8.5739 | 32279.2 |
| 8.5739 | 32294.1 |
| 8.5739 | 32309.9 |
| 8.4706 | 32372.8 |
| 8.4706 | 32377.8 |
| 8.4706 | 32383.1 |
| 8.367299999999998 | 32415.6 |
| 8.367299999999998 | 32426.7 |
| 8.367299999999998 | 32432.9 |
| 8.367299999999998 | 32439 |
| 8.367299999999998 | 32445.1 |
| 8.367299999999998 | 32455.4 |
| 8.367299999999998 | 32464.8 |
| 8.264 | 32488.3 |
| 8.264 | 32498.6 |
| 8.264 | 32503.9 |
| 8.264 | 32516 |
| 8.264 | 32522.6 |
| 8.264 | 32533.7 |
| 8.264 | 32538.7 |
| 8.1607 | 32567.6 |
| 8.1607 | 32589.4 |
| 8.1607 | 32595.6 |
| 8.1607 | 32617.9 |
| 8.1607 | 32628 |
| 8.1607 | 32633.4 |
| 8.1607 | 32645.8 |
| 8.0574 | 32652.1 |
| 8.0574 | 32663.2 |
| 8.0574 | 32681.5 |
| 8.0574 | 32688.2 |
| 8.0574 | 32711.3 |
| 8.0574 | 32733.1 |
| 7.9540999999999995 | 32739.1 |
| 7.9540999999999995 | 32762.7 |
| 7.9540999999999995 | 32816.6 |
| 7.850799999999999 | 32832.8 |
| 7.850799999999999 | 32851.5 |
| 7.850799999999999 | 32868.1 |
| 7.850799999999999 | 32885.8 |
| 7.850799999999999 | 32910.7 |
| 7.7475 | 32921.9 |
| 7.7475 | 32934.2 |
| 7.7475 | 32999.6 |
| 7.6442 | 33006.2 |
| 7.6442 | 33018.6 |
| 7.6442 | 33024.2 |
| 7.6442 | 33068 |
| 7.6442 | 33078.8 |
| 7.540899999999999 | 33095.3 |
| 7.540899999999999 | 33108.6 |
| 7.540899999999999 | 33134.7 |
| 7.540899999999999 | 33140.5 |
| 7.540899999999999 | 33173.9 |
| 7.540899999999999 | 33180.6 |
| 7.334299999999999 | 33297.4 |
| 7.334299999999999 | 33304.1 |
| 7.334299999999999 | 33311.2 |
| 7.334299999999999 | 33318.3 |
| 7.334299999999999 | 33330.9 |
| 7.334299999999999 | 33342.8 |
| 7.334299999999999 | 33363.6 |
| 7.334299999999999 | 33370.6 |
| 7.231 | 33389.1 |
| 7.231 | 33395 |
| 7.231 | 33413.6 |
| 7.231 | 33420.4 |
| 7.231 | 33434 |
| 7.231 | 33439.9 |
| 7.1277 | 33489.8 |
| 7.1277 | 33506.9 |
| 7.1277 | 33523.7 |
| 7.1277 | 33536.2 |
| 7.1277 | 33548.5 |
| 7.1277 | 33554.1 |
| 7.024399999999999 | 33565.4 |
| 7.024399999999999 | 33576.5 |
| 7.024399999999999 | 33593.3 |
| 7.024399999999999 | 33604.9 |
| 7.024399999999999 | 33639.6 |
| 7.024399999999999 | 33645.5 |
| 6.9211 | 33691.2 |
| 6.9211 | 33703 |
| 6.9211 | 33715.6 |
| 6.9211 | 33737.1 |
| 6.9211 | 33760.2 |
| 6.817799999999999 | 33777.6 |
| 6.817799999999999 | 33782.4 |
| 6.817799999999999 | 33787.1 |
| 6.817799999999999 | 33823.5 |
| 6.817799999999999 | 33833.2 |
| 6.817799999999999 | 33854.9 |
| 6.817799999999999 | 33861 |
| 6.714499999999999 | 33877.2 |
| 6.714499999999999 | 33887.1 |
| 6.714499999999999 | 33914.2 |
| 6.714499999999999 | 33945.1 |
| 6.714499999999999 | 33969.2 |
| 6.6112 | 34003.9 |
| 6.6112 | 34017 |
| 6.6112 | 34046.6 |
| 6.6112 | 34051.4 |
| 6.6112 | 34055.8 |
| 6.6112 | 34064.5 |
| 6.507899999999999 | 34089 |
| 6.507899999999999 | 34106 |
| 6.507899999999999 | 34110.8 |
| 6.507899999999999 | 34164.8 |
| 6.507899999999999 | 34170.4 |
| 6.404599999999999 | 34189.9 |
| 6.404599999999999 | 34216.9 |
| 6.404599999999999 | 34239 |
| 6.404599999999999 | 34248.9 |
| 6.404599999999999 | 34263.4 |
| 6.404599999999999 | 34272.1 |
| 6.404599999999999 | 34286.1 |
| 6.3012999999999995 | 34291.3 |
| 6.3012999999999995 | 34305.9 |
| 6.3012999999999995 | 34310.3 |
| 6.3012999999999995 | 34314.6 |
| 6.3012999999999995 | 34319.1 |
| 6.3012999999999995 | 34324 |
| 6.3012999999999995 | 34334.7 |
| 6.3012999999999995 | 34385 |
| 6.3012999999999995 | 34390.2 |
| 6.1979999999999995 | 34437.4 |
| 6.1979999999999995 | 34462.4 |
| 6.1979999999999995 | 34477.3 |
| 6.1979999999999995 | 34489 |
| 6.0947 | 34539.2 |
| 6.0947 | 34623.3 |
| 5.9914 | 34663.9 |
| 5.9914 | 34669.1 |
| 5.9914 | 34686.4 |
| 5.9914 | 34717.4 |
| 5.9914 | 34728.5 |
| 5.8881 | 34775.7 |
| 5.8881 | 34786.3 |
| 5.8881 | 34823.1 |
| 5.8881 | 34846.2 |
| 5.784799999999999 | 34865.7 |
| 5.784799999999999 | 34872.1 |
| 5.784799999999999 | 34878.1 |
| 5.784799999999999 | 34901.8 |
| 5.784799999999999 | 34908.2 |
| 5.784799999999999 | 34939.5 |
| 5.6815 | 34986 |
| 5.6815 | 34997 |
| 5.6815 | 35026.1 |
| 5.6815 | 35064 |
| 5.6815 | 35069.8 |
| 5.6815 | 35087.7 |
| 5.5782 | 35114.4 |
| 5.5782 | 35119.7 |
| 5.5782 | 35148.7 |
| 5.5782 | 35153.9 |
| 5.5782 | 35158.8 |
| 5.5782 | 35173.1 |
| 5.5782 | 35178.7 |
| 5.5782 | 35206.5 |
| 5.5782 | 35225 |
| 5.5782 | 35229.7 |
| 5.474899999999999 | 35239.6 |
| 5.474899999999999 | 35249.1 |
| 5.474899999999999 | 35257.2 |
| 5.474899999999999 | 35269.9 |
| 5.474899999999999 | 35280.8 |
| 5.474899999999999 | 35286.1 |
| 5.474899999999999 | 35318 |
| 5.474899999999999 | 35351.7 |
| 5.3716 | 35375.5 |
| 5.3716 | 35384.8 |
| 5.3716 | 35392.1 |
| 5.3716 | 35400.7 |
| 5.3716 | 35440.6 |
| 5.3716 | 35459.1 |
| 5.3716 | 35467.5 |
| 5.3716 | 35479.3 |
| 5.268299999999999 | 35503 |
| 5.268299999999999 | 35515 |
| 5.268299999999999 | 35519.1 |
| 5.268299999999999 | 35523.3 |
| 5.268299999999999 | 35542.1 |
| 5.268299999999999 | 35553.6 |
| 5.268299999999999 | 35578.2 |
| 5.268299999999999 | 35587.3 |
| 5.268299999999999 | 35604.9 |
| 5.268299999999999 | 35614.5 |
| 5.268299999999999 | 35619.7 |
| 5.164999999999999 | 35624.9 |
| 5.164999999999999 | 35630 |
| 5.164999999999999 | 35634.9 |
| 5.164999999999999 | 35644 |
| 5.164999999999999 | 35688.6 |
| 5.164999999999999 | 35740.5 |
| 5.164999999999999 | 35749.4 |
| 6.0 | 34700 |
| 7.0 | 33700 |
| 8.0 | 32700 |
| 9.0 | 31700 |
| 10.0 | 30700 |
| 12.0 | 29700 |
| 14.0 | 28700 |
| 17.0 | 27700 |
| 19.0 | 26700 |
| 23.0 | 25700 |
| 27.0 | 24700 |
| 31.0 | 23700 |
| 37.0 | 22700 |
| 43.0 | 21700 |
| 50.0 | 20700 |
| 65.69879999999999 | 19048.4 |
| 66.00869999999999 | 19016.7 |
| 66.5252 | 18970.7 |
| 67.7648 | 18856.6 |
| 68.4879 | 18781.6 |
| 68.9011 | 18744.3 |
| 69.1077 | 18726.3 |
| 70.1407 | 18637.2 |
| 71.07039999999999 | 18552.7 |
| 71.4836 | 18517.8 |
| 72.5166 | 18421.5 |
| 72.7232 | 18405.4 |
| 72.92979999999999 | 18390.2 |
| 73.4463 | 18343.8 |
| 73.65289999999999 | 18325 |
| 74.06609999999999 | 18288.4 |
| 74.5826 | 18249.7 |
| 74.7892 | 18231.1 |
| 74.99579999999999 | 18213.4 |
| 75.2024 | 18195.7 |
| 75.6156 | 18157.3 |
| 76.02879999999999 | 18126 |
| 76.442 | 18089.9 |
| 77.06179999999999 | 18037.4 |
| 77.26839999999999 | 18022.1 |
| 77.475 | 18004.2 |
| 77.6816 | 17987 |
| 78.09479999999999 | 17950.5 |
| 79.02449999999999 | 17882.3 |
| 79.33439999999999 | 17850.7 |
| 79.74759999999999 | 17817 |
| 80.2641 | 17782.5 |
| 80.4707 | 17764 |
| 81.19379999999998 | 17707.3 |
| 81.607 | 17671.2 |
| 81.91689999999998 | 17652.5 |
| 82.43339999999999 | 17614.3 |
| 82.8466 | 17578.8 |
| 83.3631 | 17542.9 |
| 83.5697 | 17524 |
| 85.11919999999999 | 17408.6 |
| 85.84229999999998 | 17351.5 |
| 86.5654 | 17302.2 |
| 87.1852 | 17253.4 |
| 87.39179999999999 | 17237.7 |
| 88.0116 | 17194.2 |
| 88.42479999999999 | 17165.4 |
| 89.45779999999999 | 17093.1 |
| 90.38749999999999 | 17023.4 |
| 91.2139 | 16966.6 |
| 92.04029999999999 | 16912.8 |
| 92.45349999999999 | 16881.2 |
| 93.1766 | 16832.4 |
| 95.13929999999999 | 16699.4 |
| 95.65579999999999 | 16665.2 |
| 97.10199999999999 | 16574.9 |
| 97.72179999999999 | 16534.2 |
| 101.33729999999998 | 16298.3 |
| 102.06039999999999 | 16257 |
| 106.70889999999999 | 15972.7 |
| 107.2254 | 15941.7 |
| 109.08479999999999 | 15831.9 |
| 113.73329999999999 | 15568.4 |
| 117.55539999999999 | 15357.9 |
| 119.93129999999998 | 15235.3 |
| 129.0217 | 14767.5 |
| 139.9715 | 14251.2 |
| 141.2111 | 14195.4 |
| 142.6573 | 14132.2 |
| 144.61999999999998 | 14045.3 |
| 146.2728 | 13975.2 |
| 146.68599999999998 | 13956.1 |
| 149.5784 | 13832.5 |
| 149.8883 | 13818.2 |
| 150.92129999999997 | 13775.1 |
| 151.2312 | 13761 |
| 153.1939 | 13681.2 |
| 153.917 | 13649.2 |
| 154.43349999999998 | 13631.6 |
| 156.70609999999996 | 13535.7 |
| 157.8424 | 13492.5 |
| 158.2556 | 13476.1 |
| 158.5655 | 13460.4 |
| 159.3919 | 13428.7 |
| 160.11499999999998 | 13398.8 |
| 161.4579 | 13348.4 |
| 161.7678 | 13337.1 |
| 162.0777 | 13324.4 |
| 162.38759999999996 | 13310.4 |
| 162.6975 | 13299.9 |
| 163.214 | 13279.8 |
| 163.5239 | 13265.1 |
| 164.24699999999999 | 13240.5 |
| 164.6602 | 13221.1 |
| 164.97009999999997 | 13210.7 |
| 165.5899 | 13187.7 |
| 166.313 | 13159.7 |
| 167.03609999999998 | 13132 |
| 167.24269999999999 | 13123 |
| 167.6559 | 13108.7 |
| 168.379 | 13080.1 |
| 169.7219 | 13032.4 |
| 169.92849999999999 | 13021.9 |
| 170.7549 | 12992.6 |
| 171.16809999999998 | 12977.9 |
| 172.20109999999997 | 12938.4 |
| 172.8209 | 12916.9 |
| 174.3704 | 12859.7 |
| 175.71329999999998 | 12812 |
| 177.88259999999997 | 12731.4 |
| 178.1925 | 12722.3 |
| 179.5354 | 12675.7 |
| 180.3618 | 12644.2 |
| 180.87829999999997 | 12627.7 |
| 181.39479999999998 | 12610.8 |
| 183.97729999999999 | 12518.7 |
| 184.28719999999998 | 12509.3 |
| 184.8037 | 12489.5 |
| 185.11359999999996 | 12479.6 |
| 185.4235 | 12469.4 |
| 185.7334 | 12459.5 |
| 186.2499 | 12440.5 |
| 186.8697 | 12420.9 |
| 187.07629999999997 | 12412.4 |
| 188.21259999999998 | 12374 |
| 190.07199999999997 | 12311.7 |
| 190.69179999999997 | 12290.6 |
| 191.0017 | 12280.4 |
| 192.13799999999998 | 12244.8 |
| 193.58419999999998 | 12197.6 |
| 194.5139 | 12167.4 |
| 194.82379999999998 | 12156.9 |
| 195.8568 | 12122.8 |
| 196.37329999999997 | 12105 |
| 197.303 | 12076.9 |
| 197.7162 | 12063.3 |
| 199.1624 | 12017 |
| 199.6789 | 11998.9 |
| 200.2987 | 11980.4 |
| 201.2284 | 11952.3 |
| 202.05479999999997 | 11923.6 |
| 202.3647 | 11914.2 |
| 202.67459999999997 | 11904.7 |
| 203.19109999999998 | 11889.6 |
| 204.4307 | 11850.4 |
| 204.8439 | 11839.4 |
| 208.35609999999997 | 11731.9 |
| 209.18249999999998 | 11705.3 |
| 209.4924 | 11696 |
| 209.80229999999997 | 11687.5 |
| 210.31879999999998 | 11669.6 |
| 210.62869999999998 | 11661.5 |
| 210.93859999999998 | 11652.6 |
| 211.1452 | 11644.8 |
| 212.07489999999999 | 11616.7 |
| 212.69469999999998 | 11598.3 |
| 213.00459999999998 | 11589.4 |
| 213.6244 | 11570.9 |
| 214.76069999999999 | 11537.1 |
| 215.38049999999998 | 11521.2 |
| 216.00029999999998 | 11502.4 |
| 216.31019999999998 | 11493.3 |
| 218.47949999999997 | 11430.6 |
| 218.99599999999998 | 11413.4 |
| 221.37189999999998 | 11344.9 |
| 223.9544 | 11272.6 |
| 224.26429999999996 | 11263.7 |
| 225.5039 | 11228.3 |
| 227.05339999999998 | 11184.2 |
| 227.46659999999997 | 11175.1 |
| 228.0864 | 11158 |
| 228.29299999999998 | 11150.1 |
| 228.6029 | 11141.9 |
| 228.91279999999998 | 11133.1 |
| 229.6359 | 11114.4 |
| 230.56559999999996 | 11086.9 |
| 231.392 | 11065.2 |
| 233.04479999999998 | 11019.6 |
| 234.3877 | 10984.6 |
| 234.69759999999997 | 10976.8 |
| 235.73059999999998 | 10948.5 |
| 236.04049999999998 | 10938.6 |
| 236.4537 | 10929 |
| 237.07349999999997 | 10911.7 |
| 237.69329999999997 | 10894.5 |
| 238.0032 | 10885.9 |
| 239.9659 | 10833.2 |
| 241.6187 | 10790.3 |
| 242.75499999999997 | 10761.3 |
| 243.0649 | 10752.2 |
| 244.09789999999998 | 10724.6 |
| 245.54409999999996 | 10687.9 |
| 246.3705 | 10664.7 |
| 247.1969 | 10644.7 |
| 248.43649999999997 | 10612.6 |
| 249.15959999999995 | 10595 |
| 249.77939999999998 | 10578.3 |
| 250.08929999999998 | 10569.8 |
| 251.12229999999997 | 10544.1 |
| 251.4322 | 10535.7 |
| 251.74209999999997 | 10527.1 |
| 252.46519999999998 | 10509.5 |
| 253.80809999999997 | 10476.2 |
| 254.53119999999998 | 10457 |
| 254.9444 | 10446.7 |
| 256.0807 | 10417.8 |
| 257.0104 | 10394 |
| 257.6302 | 10378.8 |
| 258.25 | 10362.2 |
| 258.66319999999996 | 10351.5 |
| 260.6259 | 10302.7 |
| 262.27869999999996 | 10263.3 |
| 262.6919 | 10253.7 |
| 264.2414 | 10214.9 |
| 265.37769999999995 | 10185.5 |
| 265.9975 | 10170.2 |
| 266.7206 | 10153.7 |
| 267.6503 | 10129.9 |
| 268.3734 | 10114.5 |
| 269.613 | 10084.6 |
| 271.2658 | 10044.1 |
| 271.5757 | 10036.6 |
| 274.98459999999994 | 9953.6 |
| 276.6374 | 9914.8 |
| 277.3605 | 9898.7 |
| 278.8067 | 9864.2 |
| 279.2199 | 9855.1 |
| 279.5298 | 9846.7 |
| 281.38919999999996 | 9804.1 |
| 281.5958 | 9798.2 |
| 282.21559999999994 | 9784.8 |
| 283.6618 | 9751.6 |
| 285.62449999999995 | 9706.4 |
| 285.7278 | 9702 |
| 286.0377 | 9697 |
| 287.4839 | 9662.7 |
| 288.0004 | 9650.6 |
| 288.7235 | 9635 |
| 289.3433 | 9619.9 |
| 289.5499 | 9616 |
| 292.13239999999996 | 9556.8 |
| 293.26869999999997 | 9531.4 |
| 295.5413 | 9481 |
| 297.8139 | 9430.3 |
| 301.9459 | 9337 |
| 303.08219999999994 | 9312.5 |
| 304.3218 | 9284.4 |
| 306.49109999999996 | 9238.5 |
| 307.62739999999997 | 9214 |
| 307.9373 | 9206 |
| 309.07359999999994 | 9181.5 |
| 313.3089 | 9091.7 |
| 316.2013 | 9028.1 |
| 319.4036 | 8962.1 |
| 321.46959999999996 | 8918.1 |
| 325.4983 | 8833.1 |
| 329.527 | 8750.5 |
| 342.0263 | 8497.5 |
| 343.5758 | 8467.6 |
| 362.06649999999996 | 8107.4 |
| 363.30609999999996 | 8084.8 |
| 369.19419999999997 | 7972 |
| 379.7308 | 7777.1 |
| 442.33059999999995 | 6700.3 |
| 446.66919999999993 | 6630.2 |
| 447.59889999999996 | 6616.3 |
| 448.83849999999995 | 6596.9 |
| 452.66059999999993 | 6535.8 |
| 454.10679999999996 | 6512 |
| 457.9289 | 6451.3 |
| 459.7883 | 6421.9 |
| 462.06089999999995 | 6387.4 |
| 462.47409999999996 | 6381.4 |
| 463.81699999999995 | 6359.9 |
| 464.23019999999997 | 6353.6 |
| 471.04799999999994 | 6247.3 |
| 474.45689999999996 | 6196 |
| 475.38659999999993 | 6181.9 |
| 475.7998 | 6174.9 |
| 479.0020999999999 | 6125.6 |
| 481.06809999999996 | 6094.6 |
| 481.9978 | 6081.4 |
| 487.3694 | 6000.3 |
| 490.15849999999995 | 5958.1 |
| 490.67499999999995 | 5951.4 |
| 491.0881999999999 | 5944.1 |
| 493.15419999999995 | 5913.5 |
| 494.18719999999996 | 5899.2 |
| 495.6334 | 5877.1 |
| 497.18289999999996 | 5855.1 |
| 498.11259999999993 | 5841.1 |
| 502.55449999999996 | 5776.4 |
| 506.2733 | 5721.9 |
| 507.203 | 5708.5 |
| 507.7195 | 5701 |
| 508.75249999999994 | 5686.3 |
| 509.6821999999999 | 5671.9 |
| 510.1986999999999 | 5665.5 |
| 511.74819999999994 | 5642.6 |
| 513.1944 | 5621.7 |
| 513.7108999999999 | 5614.9 |
| 514.1241 | 5608.4 |
| 514.5373 | 5602.1 |
| 515.5703 | 5587.7 |
| 517.3263999999999 | 5562.9 |
| 518.2561 | 5549.1 |
| 518.7725999999999 | 5541.8 |
| 519.7023 | 5528.6 |
| 521.5617 | 5502.4 |
| 522.4914 | 5488.7 |
| 523.6276999999999 | 5473.2 |
| 527.1399 | 5423.2 |
| 530.5488 | 5375.6 |
| 531.1686 | 5367.9 |
| 531.5817999999999 | 5361 |
| 532.5115 | 5348.2 |
| 533.4412 | 5335.6 |
| 535.4038999999999 | 5308.9 |
| 536.3336 | 5295.1 |
| 537.3666 | 5281.7 |
| 539.226 | 5255.1 |
| 540.6722 | 5235.1 |
| 541.6018999999999 | 5223.2 |
| 542.5316 | 5209.9 |
| 543.0481 | 5203.2 |
| 544.9074999999999 | 5177.3 |
| 545.9404999999999 | 5164.2 |
| 548.5229999999999 | 5128.9 |
| 549.4526999999999 | 5115.7 |
| 549.8658999999999 | 5109.9 |
| 553.9979 | 5053.9 |
| 557.5101 | 5007 |
| 557.9232999999999 | 5000.9 |
| 562.7783999999999 | 4936.5 |
| 568.5631999999999 | 4859.3 |
| 569.183 | 4851.8 |
| 569.6995 | 4845 |
| 570.7325 | 4831.6 |
| 571.6622 | 4818.4 |
| 572.6951999999999 | 4804.7 |
| 573.7281999999999 | 4791.9 |
| 574.2447 | 4785.3 |
| 575.6908999999999 | 4765.7 |
| 576.6206 | 4753.7 |
| 577.6536 | 4739.9 |
| 582.1988 | 4680.7 |
| 584.5746999999999 | 4651.3 |
| 585.6076999999999 | 4637.7 |
| 586.6406999999999 | 4624.2 |
| 589.6363999999999 | 4585.4 |
| 590.1528999999999 | 4578.9 |
| 592.1156 | 4553.7 |
| 592.6321 | 4547 |
| 593.1486 | 4541.1 |
| 595.1113 | 4515.7 |
| 596.1442999999999 | 4502.4 |
| 597.6938 | 4482.1 |
| 598.2103 | 4475.6 |
| 601.7225 | 4431.8 |
| 603.1687 | 4413.1 |
| 605.9578 | 4378.6 |
| 608.4369999999999 | 4348.1 |
| 610.9161999999999 | 4316.1 |
| 612.2591 | 4299.2 |
| 612.7756 | 4292.9 |
| 614.635 | 4270.5 |
| 616.2878 | 4250.4 |
| 617.7339999999999 | 4231.7 |
| 619.9033 | 4205.4 |
| 620.4198 | 4199.2 |
| 622.6923999999999 | 4170.7 |
| 625.8947 | 4132.1 |
| 626.4111999999999 | 4125.6 |
| 628.3738999999999 | 4101.1 |
| 628.8903999999999 | 4095 |
| 629.4069 | 4089.2 |
| 630.3366 | 4077.7 |
| 631.3696 | 4065.5 |
| 632.9191 | 4045.9 |
| 633.9521 | 4033.3 |
| 636.5346 | 4002.8 |
| 637.9807999999999 | 3985.5 |
| 641.6996 | 3940.2 |
| 642.2161 | 3934.4 |
| 643.6623 | 3916.7 |
| 646.6579999999999 | 3881.7 |
| 649.1371999999999 | 3851.9 |
| 649.6537 | 3845.8 |
| 651.7196999999999 | 3821.6 |
| 654.4055 | 3789.3 |
| 661.1199999999999 | 3711.1 |
| 665.4586 | 3660.3 |
| 667.318 | 3637.9 |
| 668.0411 | 3630.1 |
| 669.2806999999999 | 3615.2 |
| 670.4169999999999 | 3602.3 |
| 672.8961999999999 | 3574.4 |
| 673.516 | 3567.4 |
| 674.0324999999999 | 3560.9 |
| 677.8546 | 3517.6 |
| 678.3711 | 3511.1 |
| 683.4327999999999 | 3453.1 |
| 685.0856 | 3434.9 |
| 686.7383999999998 | 3415.3 |
| 687.2548999999999 | 3409.7 |
| 691.6967999999999 | 3359.9 |
| 695.0023999999999 | 3322.8 |
| 697.9981 | 3288.7 |
| 700.7871999999999 | 3258.2 |
| 704.1961 | 3219.4 |
| 704.8158999999999 | 3213.2 |
| 707.6049999999999 | 3182 |
| 710.3941 | 3151.6 |
| 711.6337 | 3137.7 |
| 712.1501999999999 | 3131.6 |
| 713.2864999999999 | 3119.5 |
| 715.0426 | 3100.2 |
| 718.5548 | 3061.8 |
| 720.2076 | 3043.2 |
| 721.4472 | 3029.7 |
| 722.6868 | 3016.8 |
| 723.2033 | 3010.6 |
| 728.265 | 2956.6 |
| 733.1201 | 2903.6 |
| 733.6366 | 2898.1 |
| 735.2893999999999 | 2880.7 |
| 749.4414999999999 | 2730.2 |
| 753.2636 | 2689.5 |
| 759.7715 | 2621.7 |
| 764.3167 | 2573.6 |
| 764.9364999999999 | 2567.4 |
| 769.6882999999999 | 2518.2 |
| 772.2708 | 2491.3 |
| 773.6136999999999 | 2477.9 |
| 782.2908999999999 | 2389.5 |
| 784.1503 | 2370.4 |
| 790.8648 | 2301.8 |
| 797.5793 | 2234.6 |
| 803.4673999999999 | 2175 |
| 805.3267999999999 | 2157.2 |
| 806.9796 | 2140 |
| 808.0126 | 2129.7 |
| 812.2478999999998 | 2087.7 |
| 821.9581 | 1992.9 |
| 826.9164999999999 | 1943.7 |
| 843.2378999999999 | 1785.8 |
| 845.6138 | 1763.6 |
| 847.8863999999999 | 1741.5 |
| 863.7946 | 1590.3 |
| 865.5506999999999 | 1574.5 |
| 867.3068 | 1557.2 |
| 869.1661999999999 | 1540.3 |
| 871.0255999999999 | 1522.7 |
| 878.2565999999999 | 1455.7 |
| 879.2896 | 1445.8 |
| 880.5292 | 1434.3 |
| 887.2436999999999 | 1371.8 |
| 896.1274999999999 | 1290.8 |
| 921.7458999999999 | 1059.3 |
| 926.1877999999999 | 1019.5 |
| 936.1046 | 931.5 |